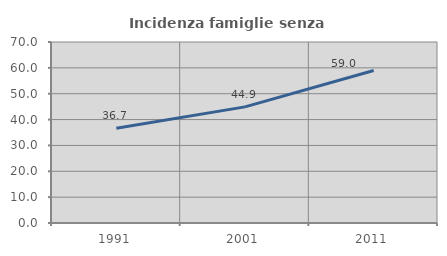
| Category | Incidenza famiglie senza nuclei |
|---|---|
| 1991.0 | 36.683 |
| 2001.0 | 44.907 |
| 2011.0 | 58.952 |